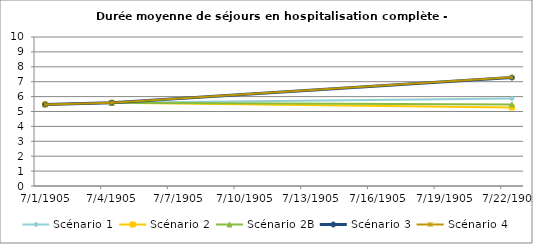
| Category | Scénario 1 | Scénario 2 | Scénario 2B | Scénario 3 | Scénario 4 |
|---|---|---|---|---|---|
| 2009.0 | 5.478 | 5.478 | 5.478 | 5.478 | 5.478 |
| 2012.0 | 5.588 | 5.588 | 5.588 | 5.588 | 5.588 |
| 2030.0 | 5.869 | 5.272 | 5.474 | 7.279 | 7.297 |